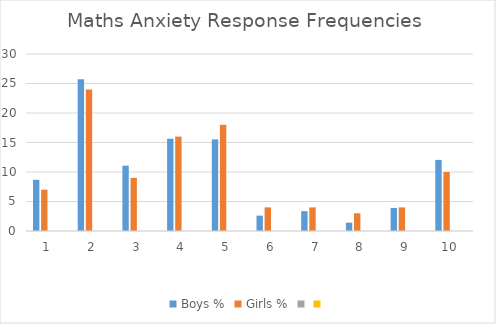
| Category | Boys % | Girls % | Series 2 | Series 3 |
|---|---|---|---|---|
| 0 | 8.686 | 7 |  |  |
| 1 | 25.733 | 24 |  |  |
| 2 | 11.075 | 9 |  |  |
| 3 | 15.635 | 16 |  |  |
| 4 | 15.527 | 18 |  |  |
| 5 | 2.606 | 4 |  |  |
| 6 | 3.366 | 4 |  |  |
| 7 | 1.412 | 3 |  |  |
| 8 | 3.909 | 4 |  |  |
| 9 | 12.052 | 10 |  |  |